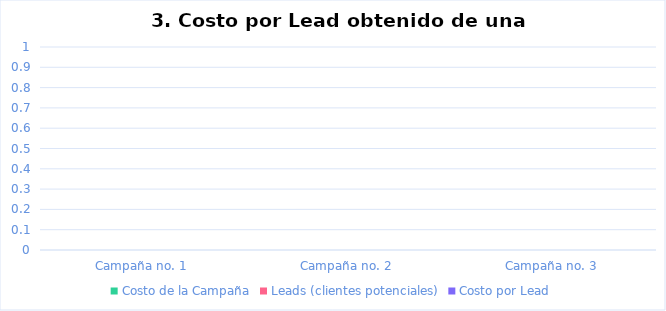
| Category | Costo de la Campaña | Leads (clientes potenciales) | Costo por Lead |
|---|---|---|---|
| Campaña no. 1 |  |  | 0 |
| Campaña no. 2 |  |  | 0 |
| Campaña no. 3 |  |  | 0 |